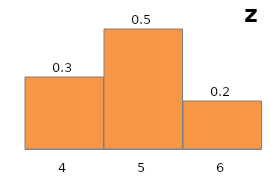
| Category | Series 1 |
|---|---|
| 4.0 | 0.3 |
| 5.0 | 0.5 |
| 6.0 | 0.2 |